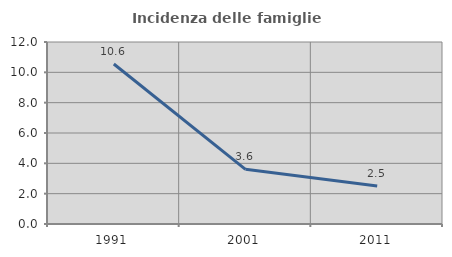
| Category | Incidenza delle famiglie numerose |
|---|---|
| 1991.0 | 10.551 |
| 2001.0 | 3.605 |
| 2011.0 | 2.506 |